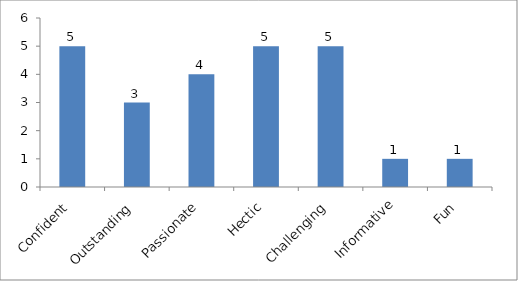
| Category | One feeling word which describes your whole experience. |
|---|---|
| Confident | 5 |
| Outstanding | 3 |
| Passionate | 4 |
| Hectic | 5 |
| Challenging | 5 |
| Informative | 1 |
| Fun | 1 |